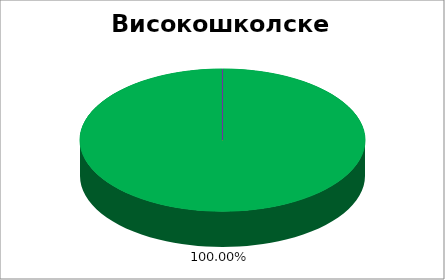
| Category | Високошколске установе |
|---|---|
| 0 | 1 |
| 1 | 0 |
| 2 | 0 |
| 3 | 0 |
| 4 | 0 |